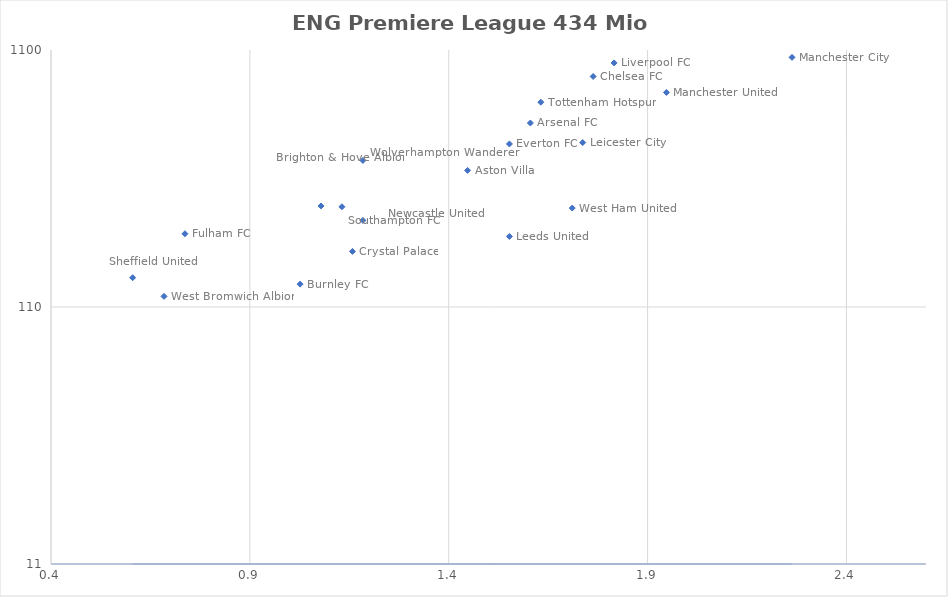
| Category | Series 0 |
|---|---|
| 2.263157894736842 | 1030 |
| 1.9473684210526316 | 752 |
| 1.8157894736842106 | 980 |
| 1.763157894736842 | 868 |
| 1.736842105263158 | 480 |
| 1.7105263157894737 | 267 |
| 1.631578947368421 | 689 |
| 1.605263157894737 | 572 |
| 1.5526315789473684 | 207 |
| 1.5526315789473684 | 474 |
| 1.4473684210526316 | 374 |
| 1.1842105263157894 | 239 |
| 1.1842105263157894 | 409 |
| 1.1578947368421053 | 181 |
| 1.131578947368421 | 270 |
| 1.0789473684210527 | 272 |
| 1.0263157894736843 | 135 |
| 0.7368421052631579 | 212 |
| 0.6842105263157895 | 121 |
| 0.6052631578947368 | 143 |